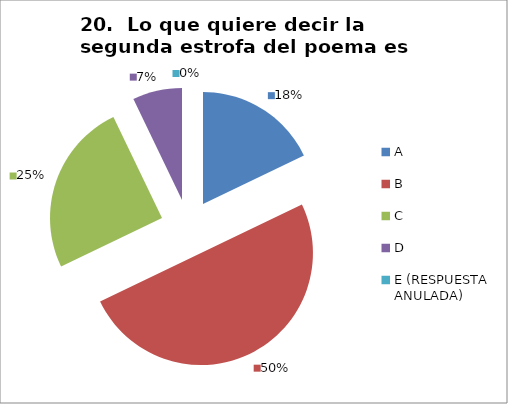
| Category | CANTIDAD DE RESPUESTAS PREGUNTA (20) | PORCENTAJE |
|---|---|---|
| A | 5 | 0.179 |
| B | 14 | 0.5 |
| C | 7 | 0.25 |
| D | 2 | 0.071 |
| E (RESPUESTA ANULADA) | 0 | 0 |